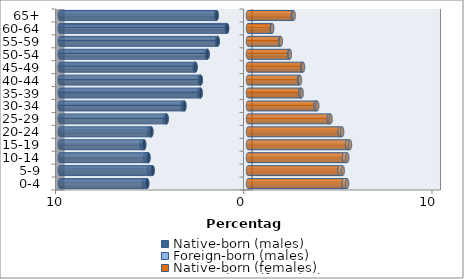
| Category | Native-born (males) | Foreign-born (males) | Native-born (females) | Foreign-born (females) |
|---|---|---|---|---|
| 0-4 | -5.356 | -0.179 | 5.089 | 0.174 |
| 5-9 | -5.066 | -0.184 | 4.86 | 0.175 |
| 10-14 | -5.288 | -0.173 | 5.098 | 0.176 |
| 15-19 | -5.516 | -0.136 | 5.275 | 0.143 |
| 20-24 | -5.134 | -0.126 | 4.872 | 0.13 |
| 25-29 | -4.325 | -0.106 | 4.292 | 0.098 |
| 30-34 | -3.381 | -0.093 | 3.593 | 0.086 |
| 35-39 | -2.518 | -0.078 | 2.784 | 0.066 |
| 40-44 | -2.51 | -0.064 | 2.708 | 0.052 |
| 45-49 | -2.789 | -0.049 | 2.885 | 0.04 |
| 50-54 | -2.149 | -0.036 | 2.193 | 0.029 |
| 55-59 | -1.611 | -0.03 | 1.715 | 0.023 |
| 60-64 | -1.112 | -0.028 | 1.266 | 0.018 |
| 65+ | -1.667 | -0.029 | 2.387 | 0.039 |